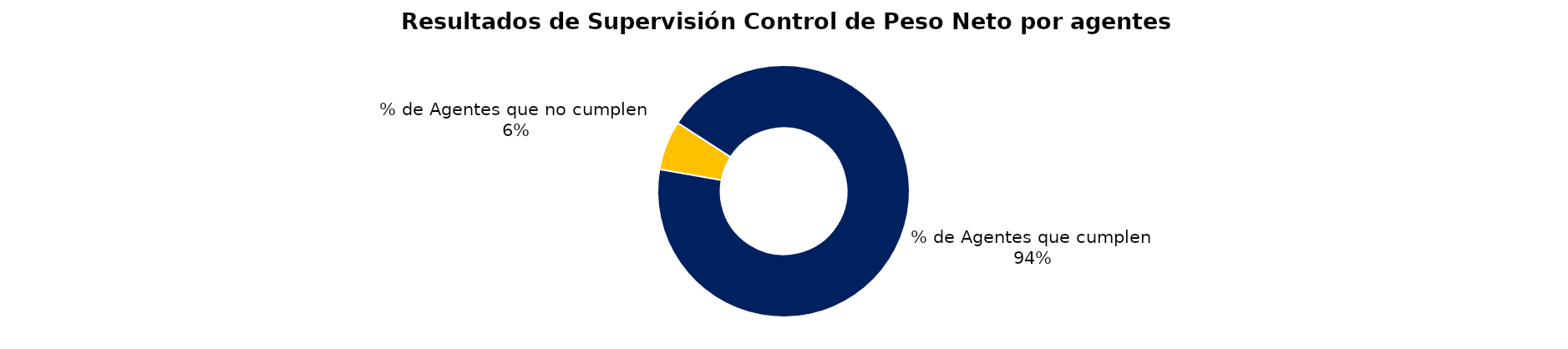
| Category | Series 0 |
|---|---|
| % de Agentes que no cumplen | 4 |
| % de Agentes que cumplen | 59 |